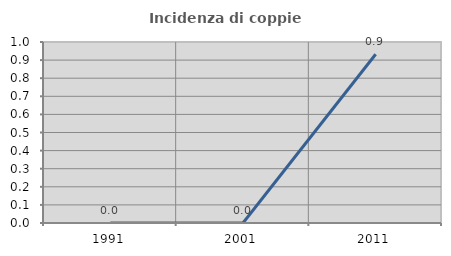
| Category | Incidenza di coppie miste |
|---|---|
| 1991.0 | 0 |
| 2001.0 | 0 |
| 2011.0 | 0.932 |